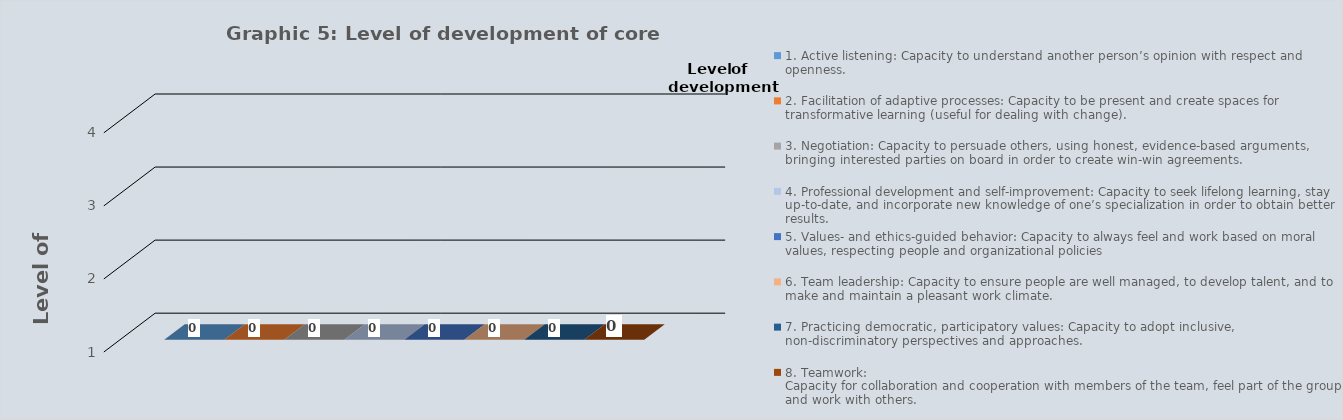
| Category | 1. Active listening: Capacity to understand another person’s opinion with respect and openness. | 2. Facilitation of adaptive processes: Capacity to be present and create spaces for transformative learning (useful for dealing with change). | 3. Negotiation: Capacity to persuade others, using honest, evidence-based arguments, bringing interested parties on board in order to create win-win agreements. | 4. Professional development and self-improvement: Capacity to seek lifelong learning, stay up-to-date, and incorporate new knowledge of one’s specialization in order to obtain better results. | 5. Values- and ethics-guided behavior: Capacity to always feel and work based on moral values, respecting people and organizational policies | 6. Team leadership: Capacity to ensure people are well managed, to develop talent, and to make and maintain a pleasant work climate. | 7. Practicing democratic, participatory values: Capacity to adopt inclusive, non-discriminatory perspectives and approaches. | 8. Teamwork:
Capacity for collaboration and cooperation with members of the team, feel part of the group and work with others. |
|---|---|---|---|---|---|---|---|---|
| 0 | 0 | 0 | 0 | 0 | 0 | 0 | 0 | 0 |